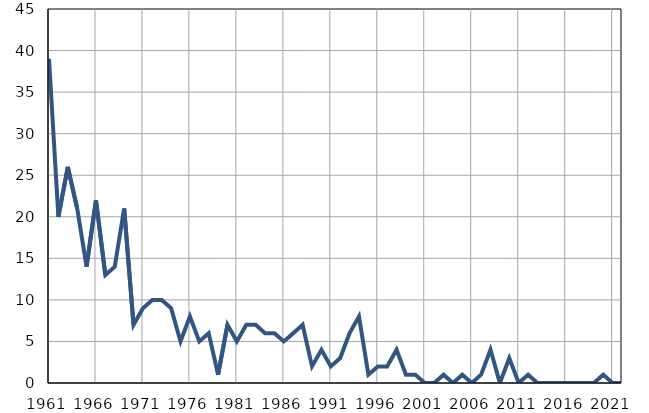
| Category | Умрла 
одојчад |
|---|---|
| 1961.0 | 39 |
| 1962.0 | 20 |
| 1963.0 | 26 |
| 1964.0 | 21 |
| 1965.0 | 14 |
| 1966.0 | 22 |
| 1967.0 | 13 |
| 1968.0 | 14 |
| 1969.0 | 21 |
| 1970.0 | 7 |
| 1971.0 | 9 |
| 1972.0 | 10 |
| 1973.0 | 10 |
| 1974.0 | 9 |
| 1975.0 | 5 |
| 1976.0 | 8 |
| 1977.0 | 5 |
| 1978.0 | 6 |
| 1979.0 | 1 |
| 1980.0 | 7 |
| 1981.0 | 5 |
| 1982.0 | 7 |
| 1983.0 | 7 |
| 1984.0 | 6 |
| 1985.0 | 6 |
| 1986.0 | 5 |
| 1987.0 | 6 |
| 1988.0 | 7 |
| 1989.0 | 2 |
| 1990.0 | 4 |
| 1991.0 | 2 |
| 1992.0 | 3 |
| 1993.0 | 6 |
| 1994.0 | 8 |
| 1995.0 | 1 |
| 1996.0 | 2 |
| 1997.0 | 2 |
| 1998.0 | 4 |
| 1999.0 | 1 |
| 2000.0 | 1 |
| 2001.0 | 0 |
| 2002.0 | 0 |
| 2003.0 | 1 |
| 2004.0 | 0 |
| 2005.0 | 1 |
| 2006.0 | 0 |
| 2007.0 | 1 |
| 2008.0 | 4 |
| 2009.0 | 0 |
| 2010.0 | 3 |
| 2011.0 | 0 |
| 2012.0 | 1 |
| 2013.0 | 0 |
| 2014.0 | 0 |
| 2015.0 | 0 |
| 2016.0 | 0 |
| 2017.0 | 0 |
| 2018.0 | 0 |
| 2019.0 | 0 |
| 2020.0 | 1 |
| 2021.0 | 0 |
| 2022.0 | 0 |